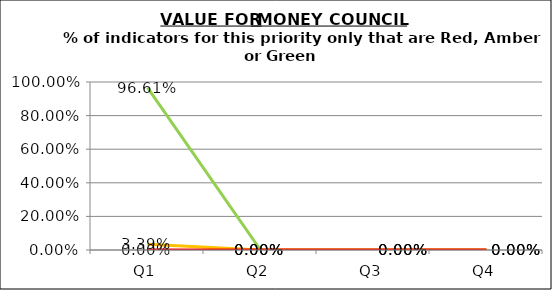
| Category | Green | Amber | Red |
|---|---|---|---|
| Q1 | 0.966 | 0.034 | 0 |
| Q2 | 0 | 0 | 0 |
| Q3 | 0 | 0 | 0 |
| Q4 | 0 | 0 | 0 |